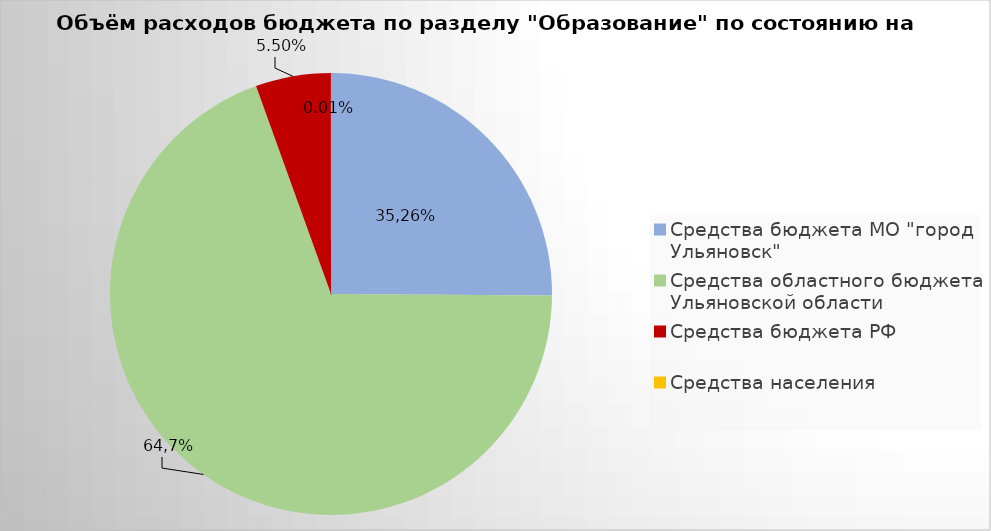
| Category | Series 0 |
|---|---|
| Средства бюджета МО "город Ульяновск" | 2198779.96 |
| Средства областного бюджета Ульяновской области | 6078657.67 |
| Средства бюджета РФ | 481889.61 |
| Средства населения | 558.01 |